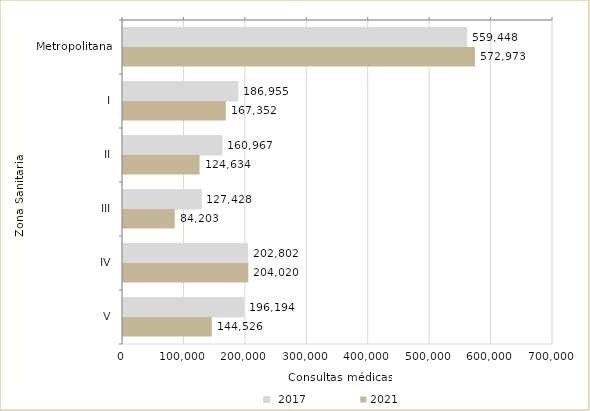
| Category | Series 0 | 2021 |
|---|---|---|
| Metropolitana | 559448 | 572973 |
| I | 186955 | 167352 |
| II | 160967 | 124634 |
| III | 127428 | 84203 |
| IV | 202802 | 204020 |
| V | 196194 | 144526 |